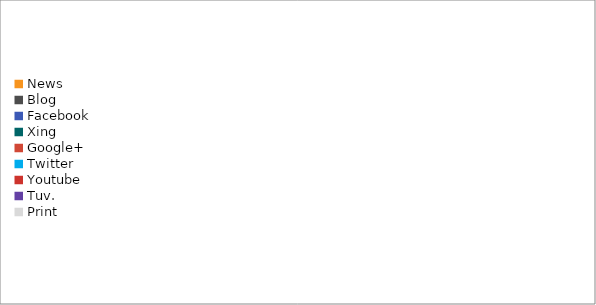
| Category | Series 0 |
|---|---|
| News | 0 |
| Blog | 0 |
| Facebook | 0 |
| Xing | 0 |
| Google+ | 0 |
| Twitter | 0 |
| Youtube | 0 |
| Tuv. | 0 |
| Print | 0 |